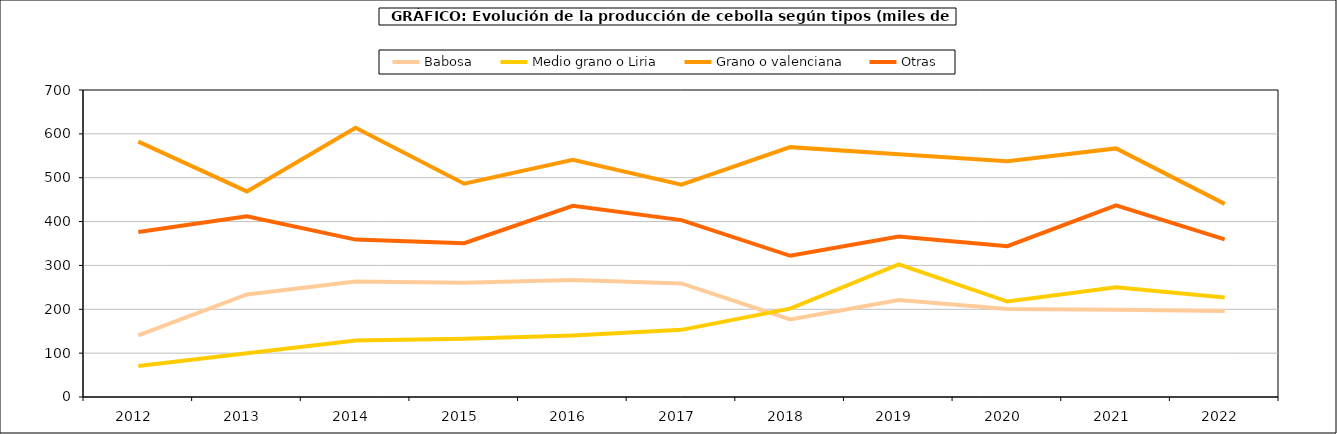
| Category | Babosa | Medio grano o Liria | Grano o valenciana | Otras |
|---|---|---|---|---|
| 2012.0 | 140.272 | 70.819 | 582.337 | 376.293 |
| 2013.0 | 233.875 | 99.562 | 468.759 | 412.305 |
| 2014.0 | 263.155 | 128.911 | 613.774 | 358.887 |
| 2015.0 | 260.238 | 132.601 | 486.456 | 350.547 |
| 2016.0 | 267.04 | 140.214 | 541.052 | 435.792 |
| 2017.0 | 258.956 | 153.086 | 484.161 | 403.331 |
| 2018.0 | 177.049 | 201.455 | 569.731 | 321.921 |
| 2019.0 | 221.244 | 302.403 | 553.585 | 365.955 |
| 2020.0 | 200.422 | 217.694 | 537.684 | 343.923 |
| 2021.0 | 199.176 | 250.207 | 566.839 | 437.193 |
| 2022.0 | 195.82 | 227.095 | 440.381 | 359.308 |